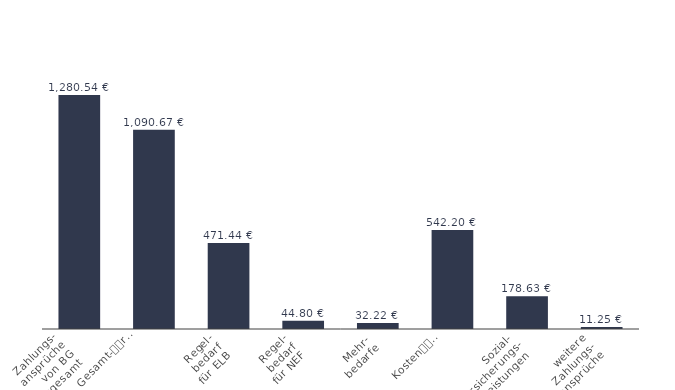
| Category | Series 5 |
|---|---|
| 0 | 1280.542 |
| 1 | 1090.668 |
| 2 | 471.435 |
| 3 | 44.804 |
| 4 | 32.224 |
| 5 | 542.205 |
| 6 | 178.626 |
| 7 | 11.248 |